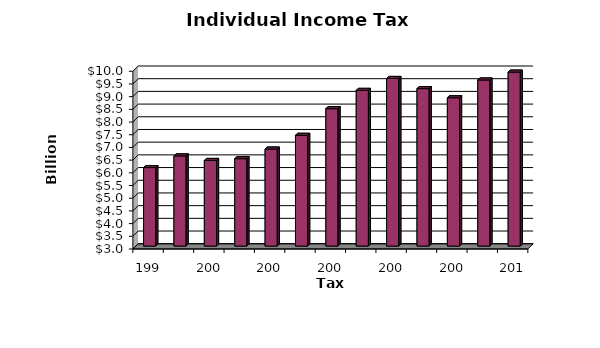
| Category | Series 0 |
|---|---|
| 1999.0 | 6.09 |
| 2000.0 | 6.55 |
| 2001.0 | 6.37 |
| 2002.0 | 6.44 |
| 2003.0 | 6.82 |
| 2004.0 | 7.36 |
| 2005.0 | 8.41 |
| 2006.0 | 9.13 |
| 2007.0 | 9.6 |
| 2008.0 | 9.2 |
| 2009.0 | 8.84 |
| 2010.0 | 9.54 |
| 2011.0 | 9.85 |